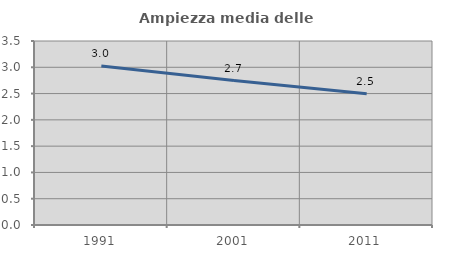
| Category | Ampiezza media delle famiglie |
|---|---|
| 1991.0 | 3.023 |
| 2001.0 | 2.747 |
| 2011.0 | 2.495 |